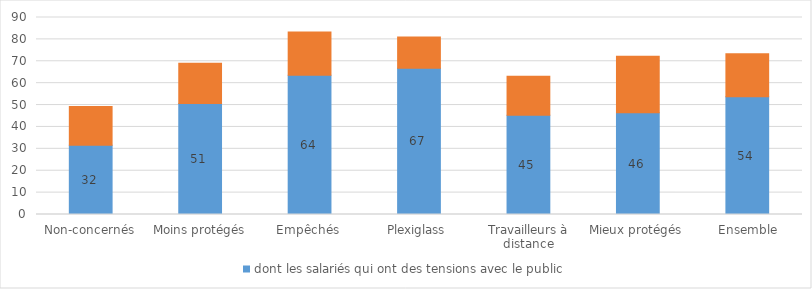
| Category | dont les salariés qui ont des tensions avec le public | dont les salariés qui n'ont pas de tensions avec le public |
|---|---|---|
| Non-concernés | 31.66 | 17.66 |
| Moins protégés | 50.76 | 18.29 |
| Empêchés | 63.67 | 19.69 |
| Plexiglass | 66.82 | 14.28 |
| Travailleurs à distance | 45.33 | 17.87 |
| Mieux protégés | 46.44 | 25.83 |
|  Ensemble | 53.85 | 19.57 |